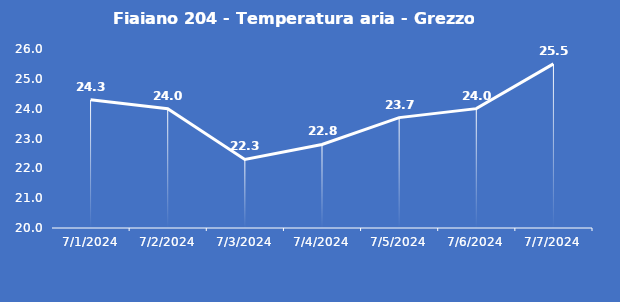
| Category | Fiaiano 204 - Temperatura aria - Grezzo (°C) |
|---|---|
| 7/1/24 | 24.3 |
| 7/2/24 | 24 |
| 7/3/24 | 22.3 |
| 7/4/24 | 22.8 |
| 7/5/24 | 23.7 |
| 7/6/24 | 24 |
| 7/7/24 | 25.5 |